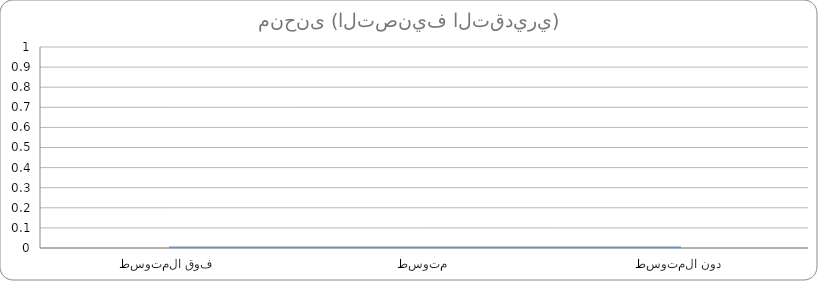
| Category | Series 0 |
|---|---|
| فوق المتوسط | 0 |
| متوسط | 0 |
| دون المتوسط | 0 |